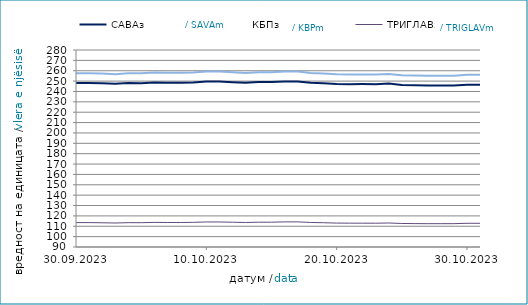
| Category | САВАз | КБПз | ТРИГЛАВз |
|---|---|---|---|
| 2023-09-30 | 248.178 | 257.618 | 113.53 |
| 2023-10-01 | 248.193 | 257.633 | 113.538 |
| 2023-10-02 | 247.868 | 257.277 | 113.364 |
| 2023-10-03 | 247.34 | 256.716 | 113.144 |
| 2023-10-04 | 248.129 | 257.563 | 113.476 |
| 2023-10-05 | 248.033 | 257.552 | 113.448 |
| 2023-10-06 | 248.665 | 258.279 | 113.724 |
| 2023-10-07 | 248.467 | 258.049 | 113.627 |
| 2023-10-08 | 248.482 | 258.064 | 113.635 |
| 2023-10-09 | 248.706 | 258.265 | 113.776 |
| 2023-10-10 | 249.614 | 259.195 | 114.149 |
| 2023-10-11 | 249.579 | 259.207 | 114.132 |
| 2023-10-12 | 249.003 | 258.653 | 113.91 |
| 2023-10-13 | 248.457 | 257.914 | 113.629 |
| 2023-10-14 | 249.034 | 258.568 | 113.909 |
| 2023-10-15 | 249.049 | 258.583 | 113.917 |
| 2023-10-16 | 249.7 | 259.348 | 114.239 |
| 2023-10-17 | 249.624 | 259.244 | 114.224 |
| 2023-10-18 | 248.503 | 257.91 | 113.679 |
| 2023-10-19 | 247.997 | 257.351 | 113.404 |
| 2023-10-20 | 247.25 | 256.499 | 113.071 |
| 2023-10-21 | 247.074 | 256.294 | 112.986 |
| 2023-10-22 | 247.089 | 256.309 | 112.994 |
| 2023-10-23 | 247.022 | 256.258 | 112.943 |
| 2023-10-24 | 247.623 | 256.798 | 113.148 |
| 2023-10-25 | 246.293 | 255.643 | 112.683 |
| 2023-10-26 | 246.053 | 255.312 | 112.564 |
| 2023-10-27 | 245.778 | 255.241 | 112.494 |
| 2023-10-28 | 245.786 | 255.253 | 112.5 |
| 2023-10-29 | 245.801 | 255.268 | 112.508 |
| 2023-10-30 | 246.414 | 256.105 | 112.87 |
| 2023-10-31 | 246.436 | 256.072 | 112.885 |